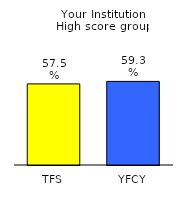
| Category | Series 0 |
|---|---|
| TFS | 0.575 |
| YFCY | 0.593 |